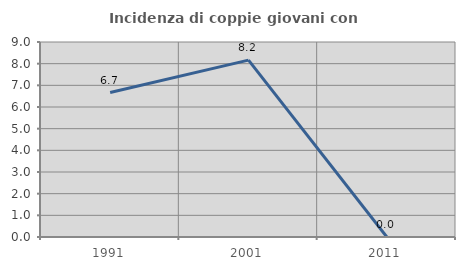
| Category | Incidenza di coppie giovani con figli |
|---|---|
| 1991.0 | 6.667 |
| 2001.0 | 8.163 |
| 2011.0 | 0 |